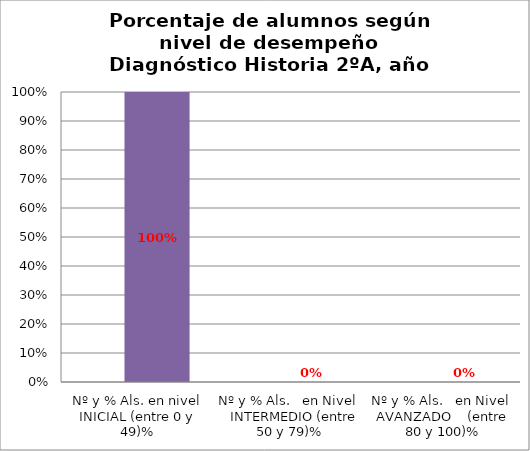
| Category | Series 0 | Series 1 | Series 2 | Series 3 |
|---|---|---|---|---|
| Nº y % Als. en nivel INICIAL (entre 0 y 49)% |  |  |  | 1 |
| Nº y % Als.   en Nivel    INTERMEDIO (entre 50 y 79)% |  |  |  | 0 |
| Nº y % Als.   en Nivel  AVANZADO    (entre 80 y 100)% |  |  |  | 0 |